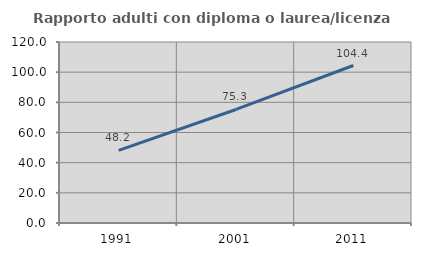
| Category | Rapporto adulti con diploma o laurea/licenza media  |
|---|---|
| 1991.0 | 48.171 |
| 2001.0 | 75.275 |
| 2011.0 | 104.42 |